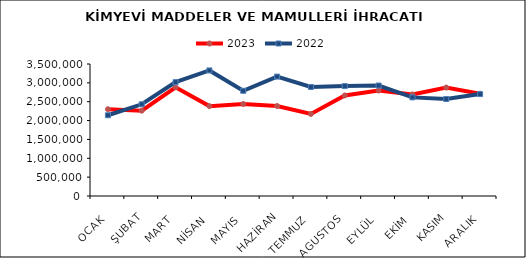
| Category | 2023 | 2022 |
|---|---|---|
| OCAK | 2300585.481 | 2140677.303 |
| ŞUBAT | 2263048.127 | 2431841.761 |
| MART | 2881732.831 | 3018845.32 |
| NİSAN | 2383101.356 | 3329388.459 |
| MAYIS | 2440354.682 | 2789048.491 |
| HAZİRAN | 2385337.538 | 3166370.937 |
| TEMMUZ | 2175524.789 | 2890074.099 |
| AGUSTOS | 2665810.065 | 2914294.645 |
| EYLÜL | 2797409.088 | 2929540.126 |
| EKİM | 2691454.41 | 2615027.335 |
| KASIM | 2875302.235 | 2572235.27 |
| ARALIK | 2712351.313 | 2701956.138 |